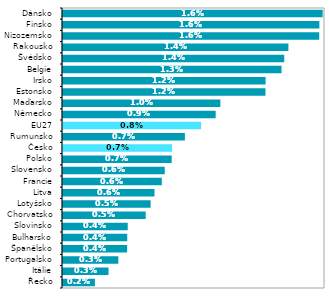
| Category | 2019 |
|---|---|
| Řecko | 0.002 |
| Itálie | 0.003 |
| Portugalsko | 0.003 |
| Španělsko | 0.004 |
| Bulharsko | 0.004 |
| Slovinsko | 0.004 |
| Chorvatsko | 0.005 |
| Lotyšsko | 0.005 |
| Litva | 0.006 |
| Francie | 0.006 |
| Slovensko | 0.006 |
| Polsko | 0.007 |
| Česko | 0.007 |
| Rumunsko | 0.007 |
| EU27 | 0.008 |
| Německo | 0.009 |
| Maďarsko | 0.01 |
| Estonsko | 0.012 |
| Irsko | 0.012 |
| Belgie | 0.013 |
| Švédsko | 0.014 |
| Rakousko | 0.014 |
| Nizozemsko | 0.016 |
| Finsko | 0.016 |
| Dánsko | 0.016 |